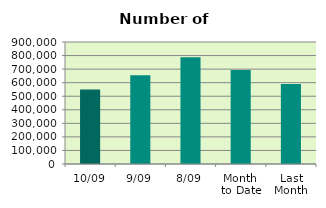
| Category | Series 0 |
|---|---|
| 10/09 | 550004 |
| 9/09 | 654890 |
| 8/09 | 788376 |
| Month 
to Date | 694097.5 |
| Last
Month | 590023.333 |